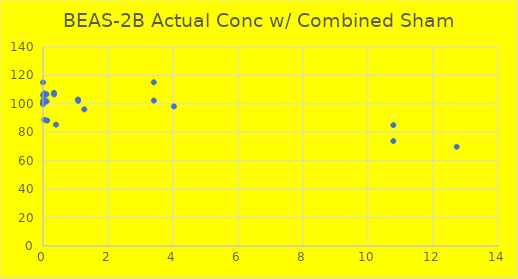
| Category | BEAS-2B Actual Conc w/ Combined Sham |
|---|---|
| 12.73 | 69.781 |
| 4.03 | 98.212 |
| 1.27 | 96.148 |
| 0.4 | 85.381 |
| 0.13 | 88.233 |
| 0.04 | 88.744 |
| 0.0 | 100 |
| 0.0 | 106.131 |
| 10.78 | 73.862 |
| 3.41 | 102.316 |
| 1.08 | 103.038 |
| 0.34 | 107.772 |
| 0.11 | 106.705 |
| 0.03 | 107.438 |
| 0.0 | 100 |
| 0.0 | 115.099 |
| 10.78 | 85.036 |
| 3.41 | 115.202 |
| 1.08 | 102.097 |
| 0.34 | 106.627 |
| 0.11 | 101.754 |
| 0.03 | 103.087 |
| 0.0 | 100 |
| 0.0 | 101.811 |